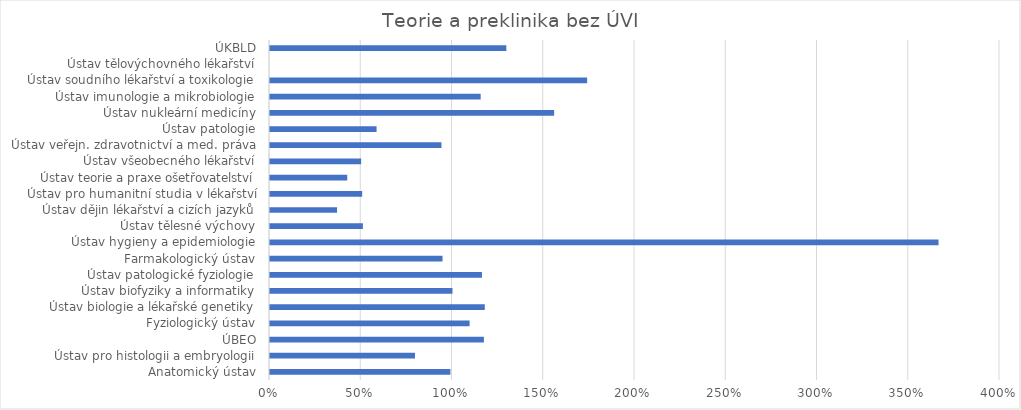
| Category | Series 0 |
|---|---|
| Anatomický ústav | 0.989 |
| Ústav pro histologii a embryologii | 0.794 |
| ÚBEO | 1.172 |
| Fyziologický ústav | 1.094 |
| Ústav biologie a lékařské genetiky | 1.177 |
| Ústav biofyziky a informatiky | 1 |
| Ústav patologické fyziologie | 1.161 |
| Farmakologický ústav | 0.945 |
| Ústav hygieny a epidemiologie | 3.663 |
| Ústav tělesné výchovy | 0.509 |
| Ústav dějin lékařství a cizích jazyků | 0.367 |
| Ústav pro humanitní studia v lékařství | 0.505 |
| Ústav teorie a praxe ošetřovatelství | 0.423 |
| Ústav všeobecného lékařství | 0.499 |
| Ústav veřejn. zdravotnictví a med. práva | 0.939 |
| Ústav patologie | 0.584 |
| Ústav nukleární medicíny | 1.557 |
| Ústav imunologie a mikrobiologie | 1.154 |
| Ústav soudního lékařství a toxikologie | 1.738 |
| Ústav tělovýchovného lékařství | 0 |
| ÚKBLD | 1.295 |